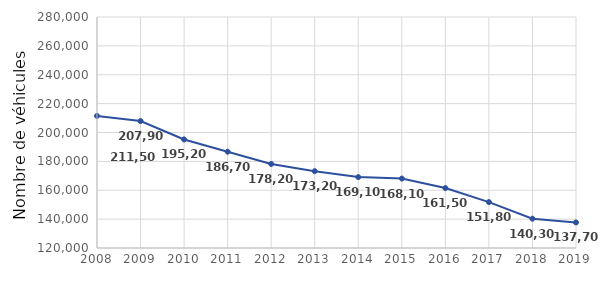
| Category | Series 0 |
|---|---|
| 2008.0 | 211500 |
| 2009.0 | 207900 |
| 2010.0 | 195200 |
| 2011.0 | 186700 |
| 2012.0 | 178200 |
| 2013.0 | 173200 |
| 2014.0 | 169100 |
| 2015.0 | 168100 |
| 2016.0 | 161500 |
| 2017.0 | 151800 |
| 2018.0 | 140300 |
| 2019.0 | 137700 |